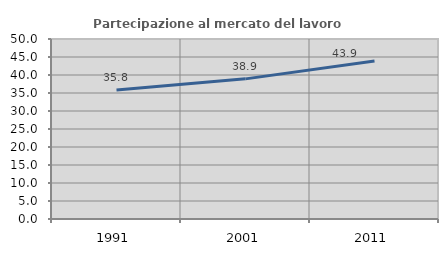
| Category | Partecipazione al mercato del lavoro  femminile |
|---|---|
| 1991.0 | 35.804 |
| 2001.0 | 38.927 |
| 2011.0 | 43.902 |